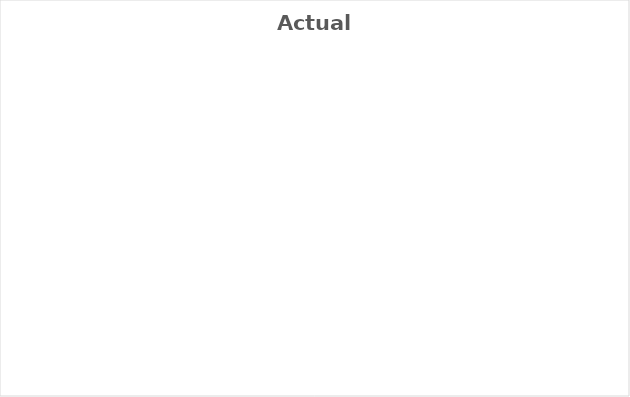
| Category | Series 0 |
|---|---|
| Rent | 0 |
| Car Insurance | 0 |
| Health Care | 0 |
| Grocery | 0 |
| Eating Out | 0 |
| Misc Impulse | 0 |
| Gas | 0 |